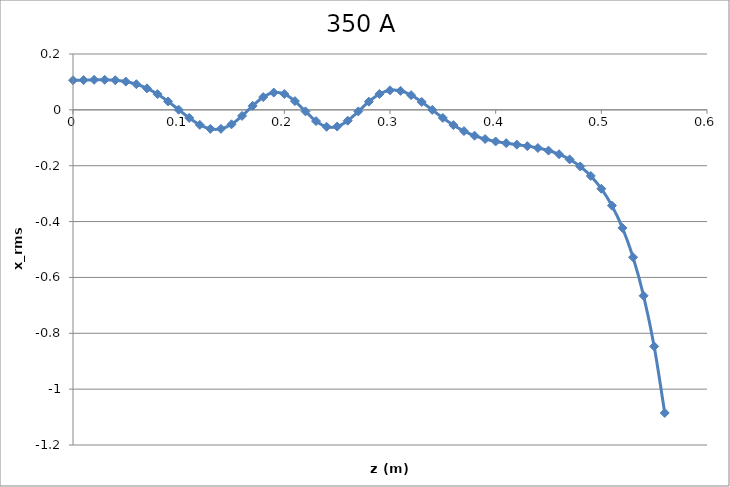
| Category | Series 0 |
|---|---|
| 0.0 | 0.106 |
| 0.01 | 0.107 |
| 0.02 | 0.107 |
| 0.03 | 0.108 |
| 0.04 | 0.106 |
| 0.05 | 0.101 |
| 0.06 | 0.092 |
| 0.07 | 0.077 |
| 0.08 | 0.056 |
| 0.09 | 0.03 |
| 0.1 | 0.001 |
| 0.11 | -0.029 |
| 0.12 | -0.054 |
| 0.13 | -0.068 |
| 0.14 | -0.068 |
| 0.15 | -0.052 |
| 0.16 | -0.022 |
| 0.17 | 0.014 |
| 0.18 | 0.046 |
| 0.19 | 0.062 |
| 0.2 | 0.057 |
| 0.21 | 0.031 |
| 0.22 | -0.006 |
| 0.23 | -0.04 |
| 0.24 | -0.061 |
| 0.25 | -0.06 |
| 0.26 | -0.039 |
| 0.27 | -0.006 |
| 0.28 | 0.029 |
| 0.29 | 0.057 |
| 0.3 | 0.07 |
| 0.31 | 0.068 |
| 0.32 | 0.053 |
| 0.33 | 0.028 |
| 0.34 | 0 |
| 0.35 | -0.029 |
| 0.36 | -0.055 |
| 0.37 | -0.076 |
| 0.38 | -0.093 |
| 0.39 | -0.105 |
| 0.4 | -0.113 |
| 0.41 | -0.119 |
| 0.42 | -0.125 |
| 0.43 | -0.13 |
| 0.44 | -0.137 |
| 0.45 | -0.146 |
| 0.46 | -0.159 |
| 0.47 | -0.177 |
| 0.48 | -0.203 |
| 0.49 | -0.237 |
| 0.5 | -0.282 |
| 0.51 | -0.343 |
| 0.52 | -0.423 |
| 0.53 | -0.528 |
| 0.54 | -0.666 |
| 0.55 | -0.847 |
| 0.56 | -1.085 |